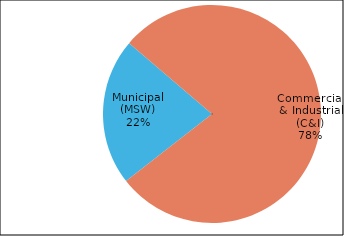
| Category | Series 0 |
|---|---|
| Municipal (MSW) | 17307 |
| Commercial & Industrial (C&I) | 62043 |
| Construction & Demolition (C&D) | 0 |